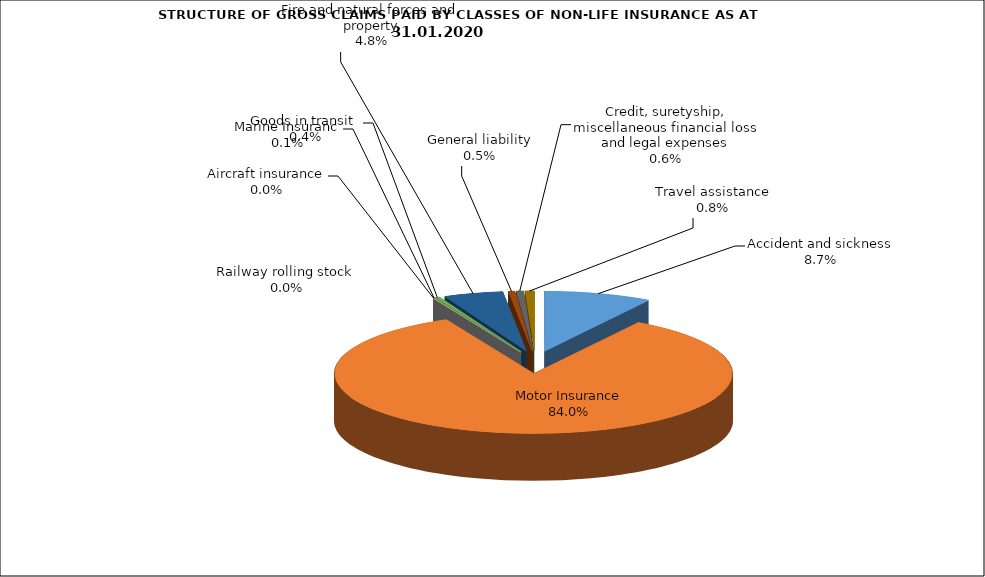
| Category | Accident and sickness | Series 1 |
|---|---|---|
| Accident and sickness | 0.087 |  |
| Motor Insurance | 0.84 |  |
| Railway rolling stock  | 0 |  |
| Aircraft insurance | 0 |  |
| Marine Insuranc | 0.001 |  |
| Goods in transit  | 0.004 |  |
| Fire and natural forces and property | 0.048 |  |
| General liability | 0.005 |  |
| Credit, suretyship, miscellaneous financial loss and legal expenses | 0.006 |  |
| Travel assistance | 0.008 |  |